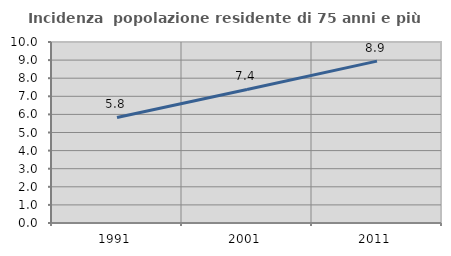
| Category | Incidenza  popolazione residente di 75 anni e più |
|---|---|
| 1991.0 | 5.833 |
| 2001.0 | 7.377 |
| 2011.0 | 8.943 |